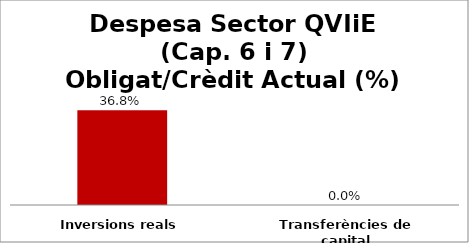
| Category | Series 0 |
|---|---|
| Inversions reals | 0.368 |
| Transferències de capital | 0 |